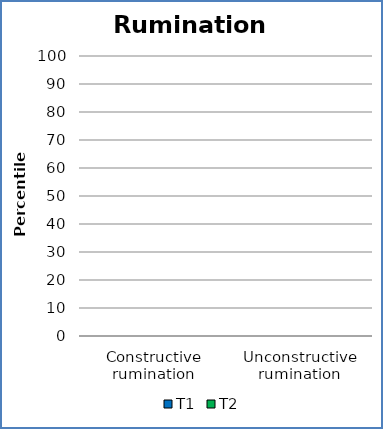
| Category | T1 | T2 |
|---|---|---|
| Constructive rumination | 0 | 0 |
| Unconstructive rumination | 0 | 0 |